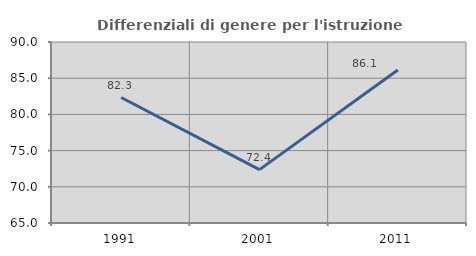
| Category | Differenziali di genere per l'istruzione superiore |
|---|---|
| 1991.0 | 82.331 |
| 2001.0 | 72.373 |
| 2011.0 | 86.123 |